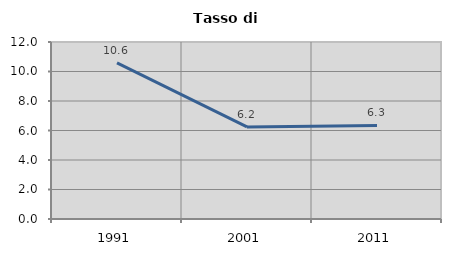
| Category | Tasso di disoccupazione   |
|---|---|
| 1991.0 | 10.583 |
| 2001.0 | 6.241 |
| 2011.0 | 6.34 |